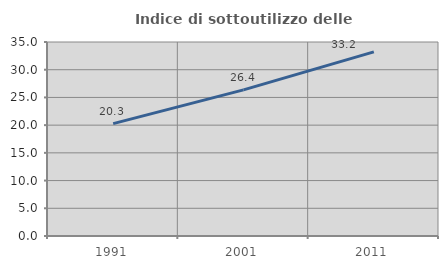
| Category | Indice di sottoutilizzo delle abitazioni  |
|---|---|
| 1991.0 | 20.27 |
| 2001.0 | 26.355 |
| 2011.0 | 33.208 |